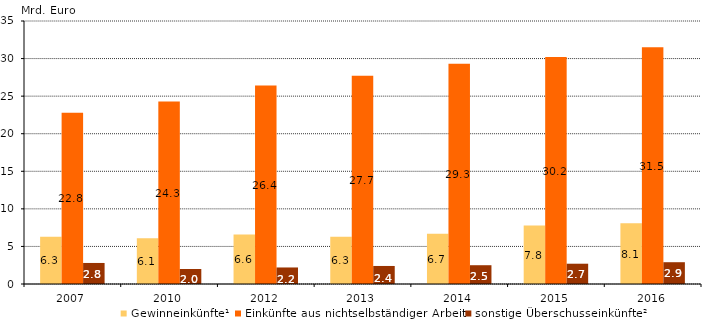
| Category | Gewinneinkünfte¹ | Einkünfte aus nichtselbständiger Arbeit | sonstige Überschusseinkünfte² |
|---|---|---|---|
| 2007.0 | 6.3 | 22.8 | 2.8 |
| 2010.0 | 6.1 | 24.3 | 2 |
| 2012.0 | 6.6 | 26.4 | 2.2 |
| 2013.0 | 6.3 | 27.7 | 2.4 |
| 2014.0 | 6.7 | 29.3 | 2.5 |
| 2015.0 | 7.8 | 30.2 | 2.7 |
| 2016.0 | 8.1 | 31.5 | 2.9 |